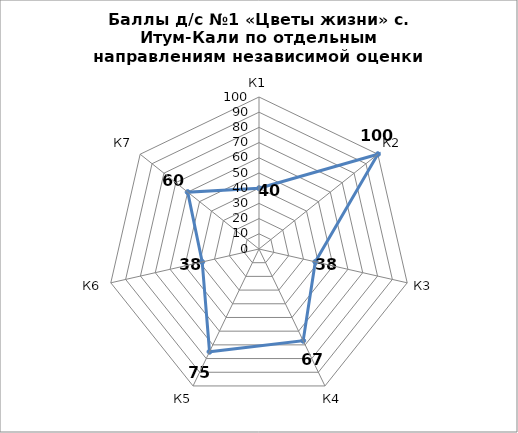
| Category | Series 0 |
|---|---|
| К1 | 40 |
| К2 | 100 |
| К3 | 38 |
| К4 | 67 |
| К5 | 75 |
| К6 | 38.33 |
| К7 | 60 |